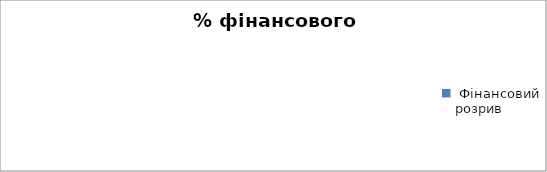
| Category | [Назва компонента <X>] | Назва компонента <X>] | Разом |
|---|---|---|---|
|  Фінансовий розрив  | 0 | 0 | 0 |